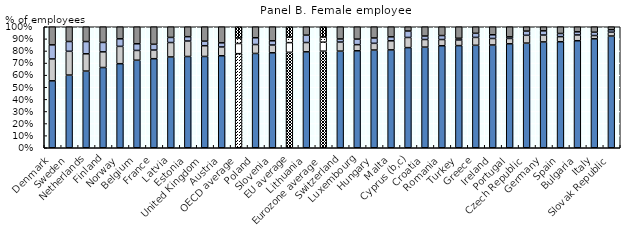
| Category | Never | Less than several times a month | Several times a month | Daily or several times a week |
|---|---|---|---|---|
| Denmark | 0.553 | 0.181 | 0.116 | 0.15 |
| Sweden | 0.601 | 0.197 | 0.081 | 0.122 |
| Netherlands | 0.634 | 0.143 | 0.101 | 0.122 |
| Finland | 0.663 | 0.129 | 0.078 | 0.13 |
| Norway | 0.695 | 0.143 | 0.062 | 0.1 |
| Belgium | 0.723 | 0.081 | 0.055 | 0.141 |
| France | 0.736 | 0.071 | 0.048 | 0.145 |
| Latvia | 0.75 | 0.119 | 0.042 | 0.088 |
| Estonia | 0.754 | 0.128 | 0.036 | 0.082 |
| United Kingdom | 0.755 | 0.089 | 0.038 | 0.119 |
| Austria | 0.76 | 0.073 | 0.034 | 0.133 |
| OECD average | 0.777 | 0.084 | 0.045 | 0.093 |
| Poland | 0.779 | 0.074 | 0.056 | 0.091 |
| Slovenia | 0.785 | 0.064 | 0.035 | 0.116 |
| EU average | 0.789 | 0.08 | 0.045 | 0.086 |
| Lithuania | 0.793 | 0.077 | 0.061 | 0.069 |
| Eurozone average | 0.798 | 0.075 | 0.043 | 0.085 |
| Switzerland | 0.799 | 0.075 | 0.026 | 0.101 |
| Luxembourg | 0.801 | 0.051 | 0.046 | 0.102 |
| Hungary | 0.808 | 0.055 | 0.044 | 0.093 |
| Malta | 0.809 | 0.075 | 0.033 | 0.083 |
| Cyprus (b,c) | 0.828 | 0.084 | 0.053 | 0.035 |
| Croatia | 0.832 | 0.063 | 0.029 | 0.077 |
| Romania | 0.843 | 0.051 | 0.033 | 0.073 |
| Turkey | 0.844 | 0.046 | 0.014 | 0.095 |
| Greece | 0.847 | 0.065 | 0.034 | 0.054 |
| Ireland | 0.849 | 0.054 | 0.031 | 0.066 |
| Portugal | 0.859 | 0.044 | 0.013 | 0.083 |
| Czech Republic | 0.865 | 0.065 | 0.034 | 0.036 |
| Germany | 0.875 | 0.057 | 0.035 | 0.034 |
| Spain | 0.876 | 0.042 | 0.026 | 0.056 |
| Bulgaria | 0.885 | 0.048 | 0.026 | 0.042 |
| Italy | 0.9 | 0.027 | 0.027 | 0.045 |
| Slovak Republic | 0.923 | 0.032 | 0.02 | 0.025 |